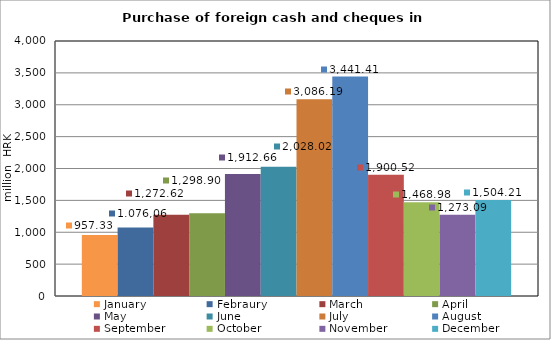
| Category | January | Febraury | March | April | May | June | July | August | September | October | November | December |
|---|---|---|---|---|---|---|---|---|---|---|---|---|
| 0 | 957.332 | 1076.055 | 1272.624 | 1298.896 | 1912.662 | 2028.017 | 3086.192 | 3441.411 | 1900.515 | 1468.983 | 1273.093 | 1504.207 |